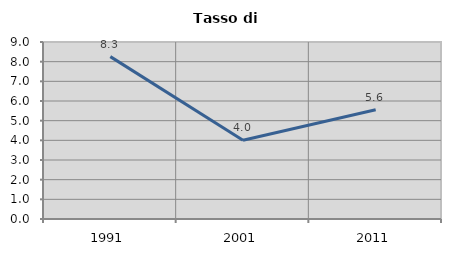
| Category | Tasso di disoccupazione   |
|---|---|
| 1991.0 | 8.257 |
| 2001.0 | 4 |
| 2011.0 | 5.556 |